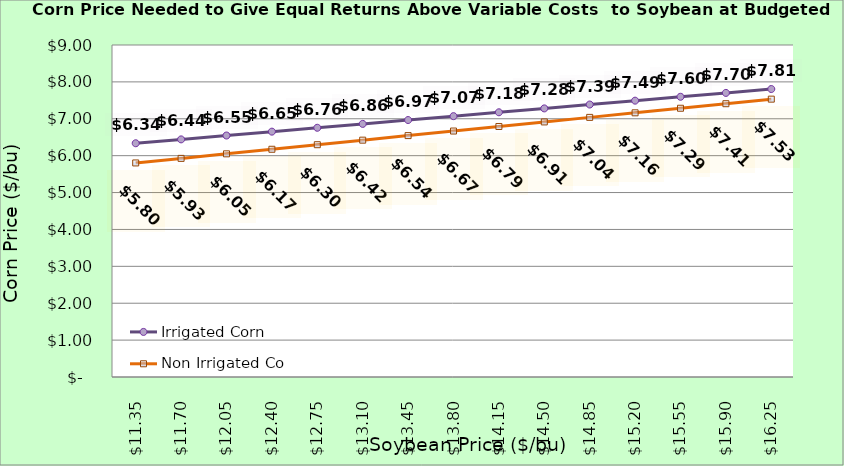
| Category | Irrigated Corn | Non Irrigated Corn |
|---|---|---|
| 11.350000000000003 | 6.336 | 5.803 |
| 11.700000000000003 | 6.441 | 5.926 |
| 12.050000000000002 | 6.546 | 6.05 |
| 12.400000000000002 | 6.651 | 6.173 |
| 12.750000000000002 | 6.756 | 6.297 |
| 13.100000000000001 | 6.861 | 6.42 |
| 13.450000000000001 | 6.966 | 6.544 |
| 13.8 | 7.071 | 6.667 |
| 14.15 | 7.176 | 6.791 |
| 14.5 | 7.281 | 6.914 |
| 14.85 | 7.386 | 7.038 |
| 15.2 | 7.491 | 7.162 |
| 15.549999999999999 | 7.596 | 7.285 |
| 15.899999999999999 | 7.701 | 7.409 |
| 16.25 | 7.806 | 7.532 |